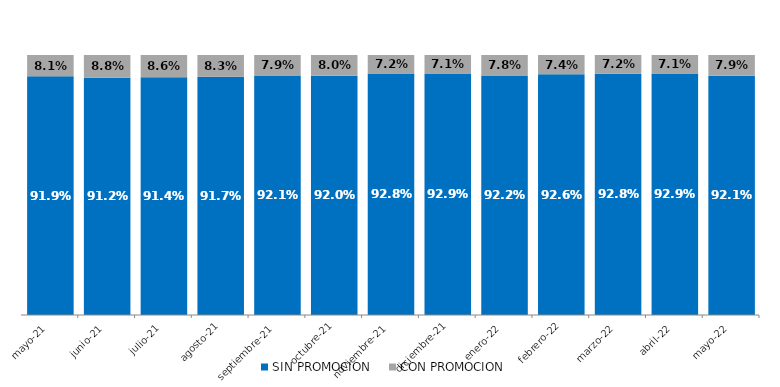
| Category | SIN PROMOCION   | CON PROMOCION   |
|---|---|---|
| 2021-05-01 | 0.919 | 0.081 |
| 2021-06-01 | 0.912 | 0.088 |
| 2021-07-01 | 0.914 | 0.086 |
| 2021-08-01 | 0.917 | 0.083 |
| 2021-09-01 | 0.921 | 0.079 |
| 2021-10-01 | 0.92 | 0.08 |
| 2021-11-01 | 0.928 | 0.072 |
| 2021-12-01 | 0.929 | 0.071 |
| 2022-01-01 | 0.922 | 0.078 |
| 2022-02-01 | 0.926 | 0.074 |
| 2022-03-01 | 0.928 | 0.072 |
| 2022-04-01 | 0.929 | 0.071 |
| 2022-05-01 | 0.921 | 0.079 |